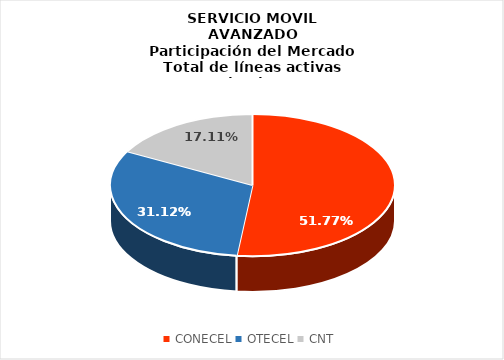
| Category | Series 0 |
|---|---|
| CONECEL | 0.518 |
| OTECEL | 0.311 |
| CNT | 0.171 |